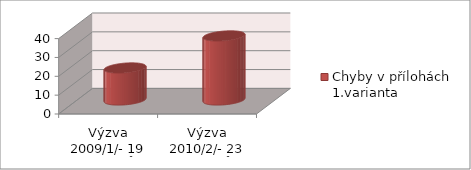
| Category | Chyby v přílohách 1.varianta |
|---|---|
| Výzva 2009/1/- 19 projektů | 17 |
| Výzva 2010/2/- 23 projektů  | 34 |